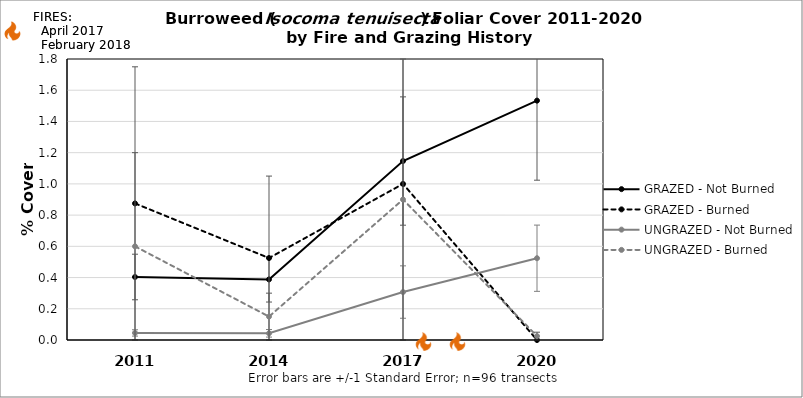
| Category | GRAZED - Not Burned | GRAZED - Burned | UNGRAZED - Not Burned | UNGRAZED - Burned |
|---|---|---|---|---|
| 2011.0 | 0.404 | 0.875 | 0.045 | 0.6 |
| 2014.0 | 0.388 | 0.525 | 0.043 | 0.15 |
| 2017.0 | 1.146 | 1 | 0.307 | 0.9 |
| 2020.0 | 1.533 | 0 | 0.524 | 0.025 |